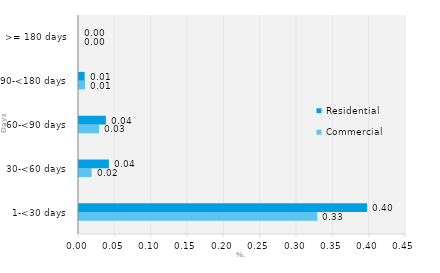
| Category | Commercial | Residential |
|---|---|---|
| 1-<30 days | 0.328 | 0.397 |
| 30-<60 days | 0.017 | 0.041 |
| 60-<90 days | 0.028 | 0.037 |
| 90-<180 days | 0.008 | 0.008 |
| >= 180 days | 0 | 0 |